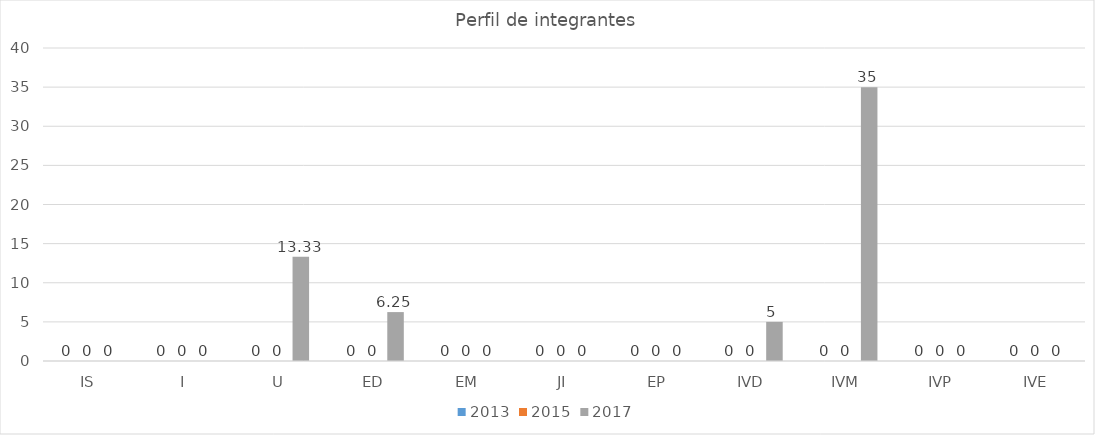
| Category | 2013 | 2015 | 2017 |
|---|---|---|---|
| IS | 0 | 0 | 0 |
| I | 0 | 0 | 0 |
| U | 0 | 0 | 13.33 |
| ED | 0 | 0 | 6.25 |
| EM | 0 | 0 | 0 |
| JI | 0 | 0 | 0 |
| EP | 0 | 0 | 0 |
| IVD | 0 | 0 | 5 |
| IVM | 0 | 0 | 35 |
| IVP | 0 | 0 | 0 |
| IVE | 0 | 0 | 0 |